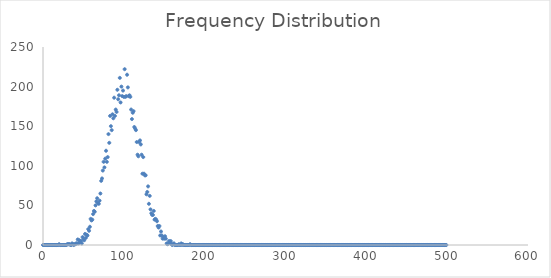
| Category | Series 0 |
|---|---|
| 0.0 | 0 |
| 1.0 | 0 |
| 2.0 | 0 |
| 3.0 | 0 |
| 4.0 | 0 |
| 5.0 | 0 |
| 6.0 | 0 |
| 7.0 | 0 |
| 8.0 | 0 |
| 9.0 | 0 |
| 10.0 | 0 |
| 11.0 | 0 |
| 12.0 | 0 |
| 13.0 | 0 |
| 14.0 | 0 |
| 15.0 | 0 |
| 16.0 | 0 |
| 17.0 | 0 |
| 18.0 | 0 |
| 19.0 | 0 |
| 20.0 | 1 |
| 21.0 | 0 |
| 22.0 | 0 |
| 23.0 | 0 |
| 24.0 | 0 |
| 25.0 | 0 |
| 26.0 | 0 |
| 27.0 | 0 |
| 28.0 | 0 |
| 29.0 | 0 |
| 30.0 | 1 |
| 31.0 | 1 |
| 32.0 | 1 |
| 33.0 | 1 |
| 34.0 | 0 |
| 35.0 | 0 |
| 36.0 | 2 |
| 37.0 | 1 |
| 38.0 | 0 |
| 39.0 | 1 |
| 40.0 | 1 |
| 41.0 | 2 |
| 42.0 | 2 |
| 43.0 | 7 |
| 44.0 | 2 |
| 45.0 | 6 |
| 46.0 | 4 |
| 47.0 | 5 |
| 48.0 | 2 |
| 49.0 | 10 |
| 50.0 | 8 |
| 51.0 | 6 |
| 52.0 | 14 |
| 53.0 | 9 |
| 54.0 | 13 |
| 55.0 | 12 |
| 56.0 | 20 |
| 57.0 | 18 |
| 58.0 | 23 |
| 59.0 | 33 |
| 60.0 | 31 |
| 61.0 | 32 |
| 62.0 | 39 |
| 63.0 | 43 |
| 64.0 | 42 |
| 65.0 | 50 |
| 66.0 | 55 |
| 67.0 | 59 |
| 68.0 | 53 |
| 69.0 | 52 |
| 70.0 | 56 |
| 71.0 | 65 |
| 72.0 | 81 |
| 73.0 | 84 |
| 74.0 | 94 |
| 75.0 | 105 |
| 76.0 | 98 |
| 77.0 | 109 |
| 78.0 | 119 |
| 79.0 | 105 |
| 80.0 | 111 |
| 81.0 | 140 |
| 82.0 | 129 |
| 83.0 | 163 |
| 84.0 | 150 |
| 85.0 | 145 |
| 86.0 | 165 |
| 87.0 | 160 |
| 88.0 | 186 |
| 89.0 | 163 |
| 90.0 | 171 |
| 91.0 | 168 |
| 92.0 | 196 |
| 93.0 | 184 |
| 94.0 | 189 |
| 95.0 | 211 |
| 96.0 | 180 |
| 97.0 | 200 |
| 98.0 | 188 |
| 99.0 | 195 |
| 100.0 | 187 |
| 101.0 | 222 |
| 102.0 | 187 |
| 103.0 | 188 |
| 104.0 | 215 |
| 105.0 | 199 |
| 106.0 | 188 |
| 107.0 | 189 |
| 108.0 | 187 |
| 109.0 | 171 |
| 110.0 | 159 |
| 111.0 | 167 |
| 112.0 | 169 |
| 113.0 | 149 |
| 114.0 | 147 |
| 115.0 | 145 |
| 116.0 | 130 |
| 117.0 | 114 |
| 118.0 | 112 |
| 119.0 | 130 |
| 120.0 | 132 |
| 121.0 | 127 |
| 122.0 | 114 |
| 123.0 | 90 |
| 124.0 | 111 |
| 125.0 | 90 |
| 126.0 | 88 |
| 127.0 | 88 |
| 128.0 | 64 |
| 129.0 | 67 |
| 130.0 | 74 |
| 131.0 | 52 |
| 132.0 | 62 |
| 133.0 | 45 |
| 134.0 | 40 |
| 135.0 | 38 |
| 136.0 | 38 |
| 137.0 | 43 |
| 138.0 | 32 |
| 139.0 | 33 |
| 140.0 | 32 |
| 141.0 | 30 |
| 142.0 | 24 |
| 143.0 | 22 |
| 144.0 | 24 |
| 145.0 | 12 |
| 146.0 | 17 |
| 147.0 | 12 |
| 148.0 | 8 |
| 149.0 | 10 |
| 150.0 | 8 |
| 151.0 | 11 |
| 152.0 | 8 |
| 153.0 | 2 |
| 154.0 | 1 |
| 155.0 | 2 |
| 156.0 | 5 |
| 157.0 | 3 |
| 158.0 | 5 |
| 159.0 | 1 |
| 160.0 | 0 |
| 161.0 | 1 |
| 162.0 | 2 |
| 163.0 | 0 |
| 164.0 | 0 |
| 165.0 | 0 |
| 166.0 | 0 |
| 167.0 | 0 |
| 168.0 | 1 |
| 169.0 | 0 |
| 170.0 | 0 |
| 171.0 | 2 |
| 172.0 | 0 |
| 173.0 | 1 |
| 174.0 | 0 |
| 175.0 | 0 |
| 176.0 | 0 |
| 177.0 | 0 |
| 178.0 | 0 |
| 179.0 | 0 |
| 180.0 | 0 |
| 181.0 | 0 |
| 182.0 | 1 |
| 183.0 | 0 |
| 184.0 | 0 |
| 185.0 | 0 |
| 186.0 | 0 |
| 187.0 | 0 |
| 188.0 | 0 |
| 189.0 | 0 |
| 190.0 | 0 |
| 191.0 | 0 |
| 192.0 | 0 |
| 193.0 | 0 |
| 194.0 | 0 |
| 195.0 | 0 |
| 196.0 | 0 |
| 197.0 | 0 |
| 198.0 | 0 |
| 199.0 | 0 |
| 200.0 | 0 |
| 201.0 | 0 |
| 202.0 | 0 |
| 203.0 | 0 |
| 204.0 | 0 |
| 205.0 | 0 |
| 206.0 | 0 |
| 207.0 | 0 |
| 208.0 | 0 |
| 209.0 | 0 |
| 210.0 | 0 |
| 211.0 | 0 |
| 212.0 | 0 |
| 213.0 | 0 |
| 214.0 | 0 |
| 215.0 | 0 |
| 216.0 | 0 |
| 217.0 | 0 |
| 218.0 | 0 |
| 219.0 | 0 |
| 220.0 | 0 |
| 221.0 | 0 |
| 222.0 | 0 |
| 223.0 | 0 |
| 224.0 | 0 |
| 225.0 | 0 |
| 226.0 | 0 |
| 227.0 | 0 |
| 228.0 | 0 |
| 229.0 | 0 |
| 230.0 | 0 |
| 231.0 | 0 |
| 232.0 | 0 |
| 233.0 | 0 |
| 234.0 | 0 |
| 235.0 | 0 |
| 236.0 | 0 |
| 237.0 | 0 |
| 238.0 | 0 |
| 239.0 | 0 |
| 240.0 | 0 |
| 241.0 | 0 |
| 242.0 | 0 |
| 243.0 | 0 |
| 244.0 | 0 |
| 245.0 | 0 |
| 246.0 | 0 |
| 247.0 | 0 |
| 248.0 | 0 |
| 249.0 | 0 |
| 250.0 | 0 |
| 251.0 | 0 |
| 252.0 | 0 |
| 253.0 | 0 |
| 254.0 | 0 |
| 255.0 | 0 |
| 256.0 | 0 |
| 257.0 | 0 |
| 258.0 | 0 |
| 259.0 | 0 |
| 260.0 | 0 |
| 261.0 | 0 |
| 262.0 | 0 |
| 263.0 | 0 |
| 264.0 | 0 |
| 265.0 | 0 |
| 266.0 | 0 |
| 267.0 | 0 |
| 268.0 | 0 |
| 269.0 | 0 |
| 270.0 | 0 |
| 271.0 | 0 |
| 272.0 | 0 |
| 273.0 | 0 |
| 274.0 | 0 |
| 275.0 | 0 |
| 276.0 | 0 |
| 277.0 | 0 |
| 278.0 | 0 |
| 279.0 | 0 |
| 280.0 | 0 |
| 281.0 | 0 |
| 282.0 | 0 |
| 283.0 | 0 |
| 284.0 | 0 |
| 285.0 | 0 |
| 286.0 | 0 |
| 287.0 | 0 |
| 288.0 | 0 |
| 289.0 | 0 |
| 290.0 | 0 |
| 291.0 | 0 |
| 292.0 | 0 |
| 293.0 | 0 |
| 294.0 | 0 |
| 295.0 | 0 |
| 296.0 | 0 |
| 297.0 | 0 |
| 298.0 | 0 |
| 299.0 | 0 |
| 300.0 | 0 |
| 301.0 | 0 |
| 302.0 | 0 |
| 303.0 | 0 |
| 304.0 | 0 |
| 305.0 | 0 |
| 306.0 | 0 |
| 307.0 | 0 |
| 308.0 | 0 |
| 309.0 | 0 |
| 310.0 | 0 |
| 311.0 | 0 |
| 312.0 | 0 |
| 313.0 | 0 |
| 314.0 | 0 |
| 315.0 | 0 |
| 316.0 | 0 |
| 317.0 | 0 |
| 318.0 | 0 |
| 319.0 | 0 |
| 320.0 | 0 |
| 321.0 | 0 |
| 322.0 | 0 |
| 323.0 | 0 |
| 324.0 | 0 |
| 325.0 | 0 |
| 326.0 | 0 |
| 327.0 | 0 |
| 328.0 | 0 |
| 329.0 | 0 |
| 330.0 | 0 |
| 331.0 | 0 |
| 332.0 | 0 |
| 333.0 | 0 |
| 334.0 | 0 |
| 335.0 | 0 |
| 336.0 | 0 |
| 337.0 | 0 |
| 338.0 | 0 |
| 339.0 | 0 |
| 340.0 | 0 |
| 341.0 | 0 |
| 342.0 | 0 |
| 343.0 | 0 |
| 344.0 | 0 |
| 345.0 | 0 |
| 346.0 | 0 |
| 347.0 | 0 |
| 348.0 | 0 |
| 349.0 | 0 |
| 350.0 | 0 |
| 351.0 | 0 |
| 352.0 | 0 |
| 353.0 | 0 |
| 354.0 | 0 |
| 355.0 | 0 |
| 356.0 | 0 |
| 357.0 | 0 |
| 358.0 | 0 |
| 359.0 | 0 |
| 360.0 | 0 |
| 361.0 | 0 |
| 362.0 | 0 |
| 363.0 | 0 |
| 364.0 | 0 |
| 365.0 | 0 |
| 366.0 | 0 |
| 367.0 | 0 |
| 368.0 | 0 |
| 369.0 | 0 |
| 370.0 | 0 |
| 371.0 | 0 |
| 372.0 | 0 |
| 373.0 | 0 |
| 374.0 | 0 |
| 375.0 | 0 |
| 376.0 | 0 |
| 377.0 | 0 |
| 378.0 | 0 |
| 379.0 | 0 |
| 380.0 | 0 |
| 381.0 | 0 |
| 382.0 | 0 |
| 383.0 | 0 |
| 384.0 | 0 |
| 385.0 | 0 |
| 386.0 | 0 |
| 387.0 | 0 |
| 388.0 | 0 |
| 389.0 | 0 |
| 390.0 | 0 |
| 391.0 | 0 |
| 392.0 | 0 |
| 393.0 | 0 |
| 394.0 | 0 |
| 395.0 | 0 |
| 396.0 | 0 |
| 397.0 | 0 |
| 398.0 | 0 |
| 399.0 | 0 |
| 400.0 | 0 |
| 401.0 | 0 |
| 402.0 | 0 |
| 403.0 | 0 |
| 404.0 | 0 |
| 405.0 | 0 |
| 406.0 | 0 |
| 407.0 | 0 |
| 408.0 | 0 |
| 409.0 | 0 |
| 410.0 | 0 |
| 411.0 | 0 |
| 412.0 | 0 |
| 413.0 | 0 |
| 414.0 | 0 |
| 415.0 | 0 |
| 416.0 | 0 |
| 417.0 | 0 |
| 418.0 | 0 |
| 419.0 | 0 |
| 420.0 | 0 |
| 421.0 | 0 |
| 422.0 | 0 |
| 423.0 | 0 |
| 424.0 | 0 |
| 425.0 | 0 |
| 426.0 | 0 |
| 427.0 | 0 |
| 428.0 | 0 |
| 429.0 | 0 |
| 430.0 | 0 |
| 431.0 | 0 |
| 432.0 | 0 |
| 433.0 | 0 |
| 434.0 | 0 |
| 435.0 | 0 |
| 436.0 | 0 |
| 437.0 | 0 |
| 438.0 | 0 |
| 439.0 | 0 |
| 440.0 | 0 |
| 441.0 | 0 |
| 442.0 | 0 |
| 443.0 | 0 |
| 444.0 | 0 |
| 445.0 | 0 |
| 446.0 | 0 |
| 447.0 | 0 |
| 448.0 | 0 |
| 449.0 | 0 |
| 450.0 | 0 |
| 451.0 | 0 |
| 452.0 | 0 |
| 453.0 | 0 |
| 454.0 | 0 |
| 455.0 | 0 |
| 456.0 | 0 |
| 457.0 | 0 |
| 458.0 | 0 |
| 459.0 | 0 |
| 460.0 | 0 |
| 461.0 | 0 |
| 462.0 | 0 |
| 463.0 | 0 |
| 464.0 | 0 |
| 465.0 | 0 |
| 466.0 | 0 |
| 467.0 | 0 |
| 468.0 | 0 |
| 469.0 | 0 |
| 470.0 | 0 |
| 471.0 | 0 |
| 472.0 | 0 |
| 473.0 | 0 |
| 474.0 | 0 |
| 475.0 | 0 |
| 476.0 | 0 |
| 477.0 | 0 |
| 478.0 | 0 |
| 479.0 | 0 |
| 480.0 | 0 |
| 481.0 | 0 |
| 482.0 | 0 |
| 483.0 | 0 |
| 484.0 | 0 |
| 485.0 | 0 |
| 486.0 | 0 |
| 487.0 | 0 |
| 488.0 | 0 |
| 489.0 | 0 |
| 490.0 | 0 |
| 491.0 | 0 |
| 492.0 | 0 |
| 493.0 | 0 |
| 494.0 | 0 |
| 495.0 | 0 |
| 496.0 | 0 |
| 497.0 | 0 |
| 498.0 | 0 |
| 499.0 | 0 |